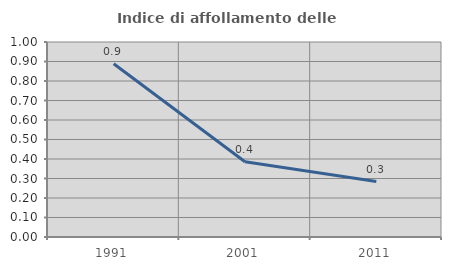
| Category | Indice di affollamento delle abitazioni  |
|---|---|
| 1991.0 | 0.889 |
| 2001.0 | 0.386 |
| 2011.0 | 0.285 |